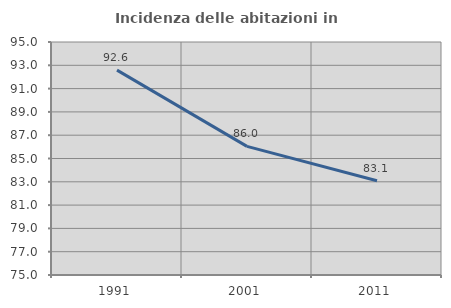
| Category | Incidenza delle abitazioni in proprietà  |
|---|---|
| 1991.0 | 92.586 |
| 2001.0 | 86.039 |
| 2011.0 | 83.096 |